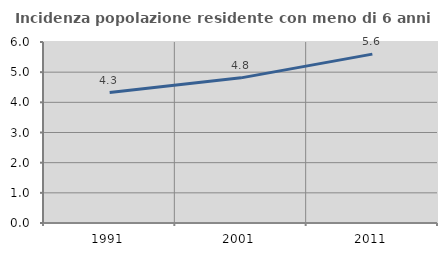
| Category | Incidenza popolazione residente con meno di 6 anni |
|---|---|
| 1991.0 | 4.325 |
| 2001.0 | 4.811 |
| 2011.0 | 5.598 |